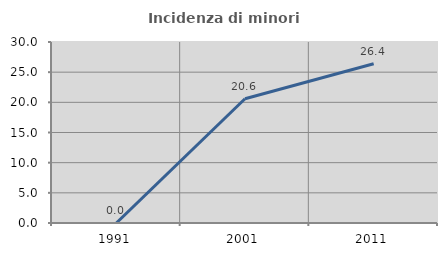
| Category | Incidenza di minori stranieri |
|---|---|
| 1991.0 | 0 |
| 2001.0 | 20.588 |
| 2011.0 | 26.389 |